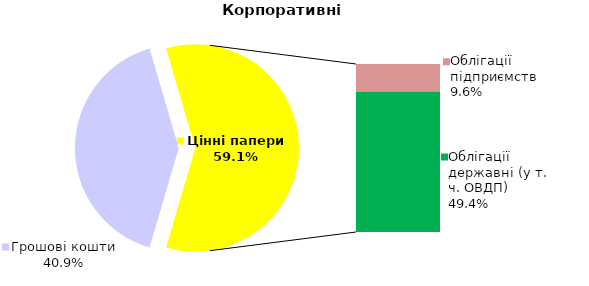
| Category | Корпоративні |
|---|---|
| Грошові кошти | 90.262 |
| Банківські метали | 0 |
| Нерухомість | 0 |
| Інші активи | 0 |
| Акції | 0.042 |
| Облігації підприємств | 21.26 |
| Муніципальні облігації | 0 |
| Облігації державні (у т. ч. ОВДП) | 108.912 |